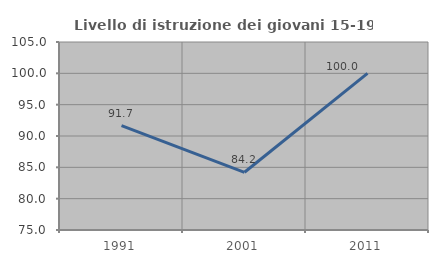
| Category | Livello di istruzione dei giovani 15-19 anni |
|---|---|
| 1991.0 | 91.667 |
| 2001.0 | 84.211 |
| 2011.0 | 100 |